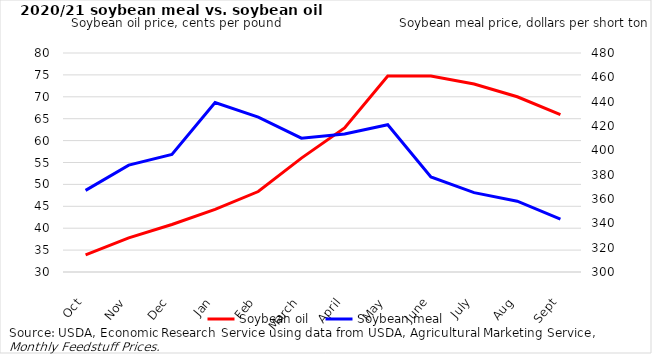
| Category | Soybean oil |
|---|---|
| Oct | 33.91 |
| Nov | 37.79 |
| Dec | 40.85 |
| Jan | 44.31 |
| Feb | 48.37 |
| March | 56 |
| April | 62.88 |
| May | 74.75 |
| June | 74.75 |
| July | 72.93 |
| Aug | 70.01 |
| Sept | 65.93 |